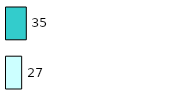
| Category | Series 0 | Series 1 |
|---|---|---|
| 0 | 27 | 35 |